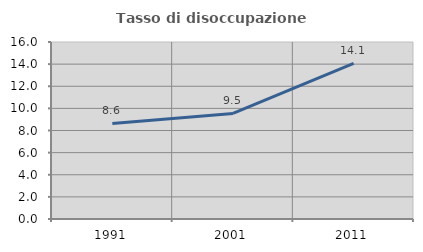
| Category | Tasso di disoccupazione giovanile  |
|---|---|
| 1991.0 | 8.633 |
| 2001.0 | 9.541 |
| 2011.0 | 14.07 |